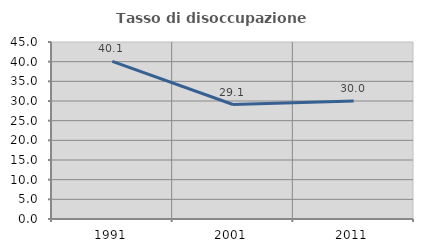
| Category | Tasso di disoccupazione giovanile  |
|---|---|
| 1991.0 | 40.072 |
| 2001.0 | 29.11 |
| 2011.0 | 30 |